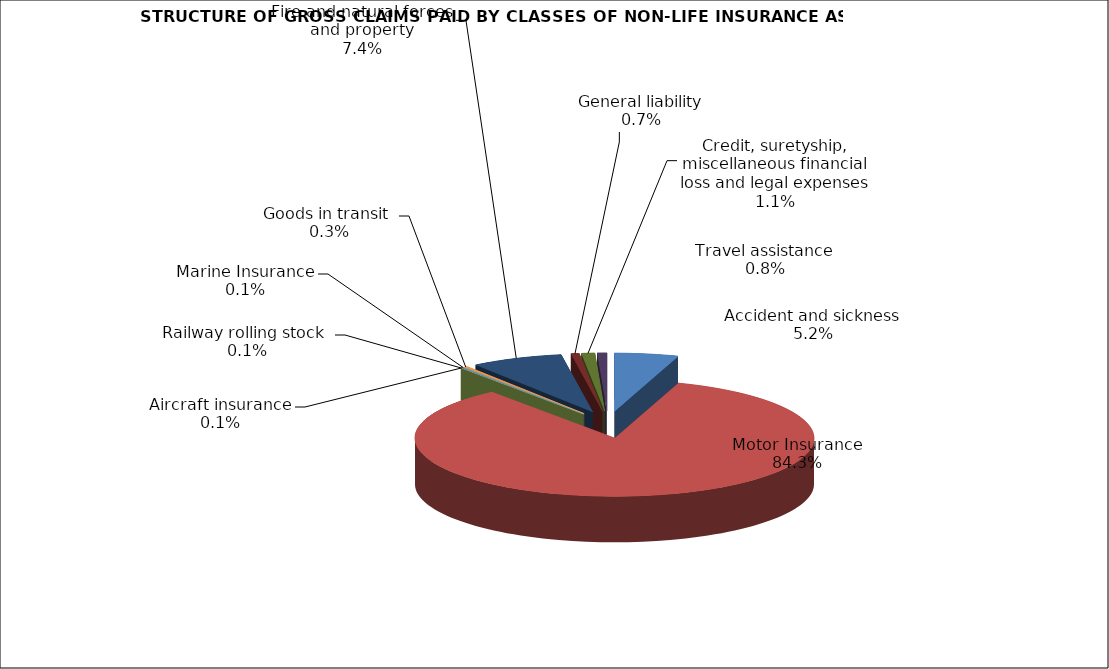
| Category | Accident and sickness |
|---|---|
| Accident and sickness | 0.052 |
| Motor Insurance | 0.843 |
| Railway rolling stock  | 0.001 |
| Aircraft insurance | 0.001 |
| Marine Insurance | 0.001 |
| Goods in transit  | 0.003 |
| Fire and natural forces and property | 0.074 |
| General liability | 0.007 |
| Credit, suretyship, miscellaneous financial loss and legal expenses | 0.011 |
| Travel assistance | 0.008 |